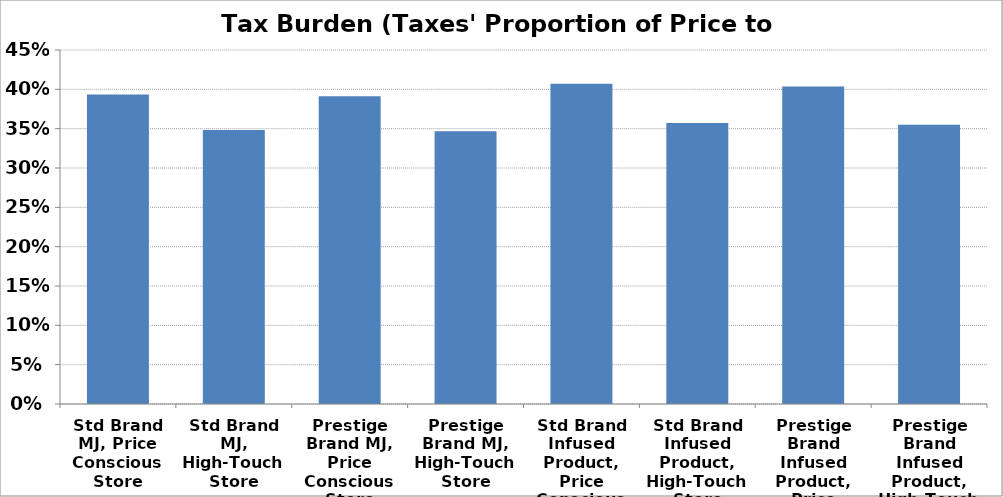
| Category | Tax Burden (Taxes' Proportion of Price to Consumer) |
|---|---|
| Std Brand MJ, Price Conscious Store | 0.393 |
| Std Brand MJ, High-Touch Store | 0.348 |
| Prestige Brand MJ, Price Conscious Store | 0.391 |
| Prestige Brand MJ, High-Touch Store | 0.347 |
| Std Brand Infused Product, Price Conscious Store | 0.407 |
| Std Brand Infused Product, High-Touch Store | 0.357 |
| Prestige Brand Infused Product, Price Conscious Store | 0.404 |
| Prestige Brand Infused Product, High-Touch Store | 0.355 |